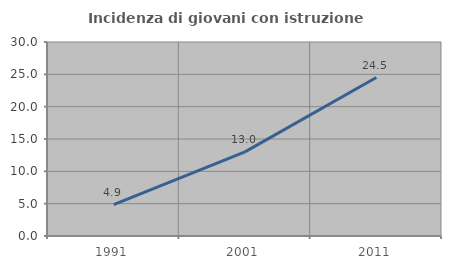
| Category | Incidenza di giovani con istruzione universitaria |
|---|---|
| 1991.0 | 4.867 |
| 2001.0 | 13.011 |
| 2011.0 | 24.5 |